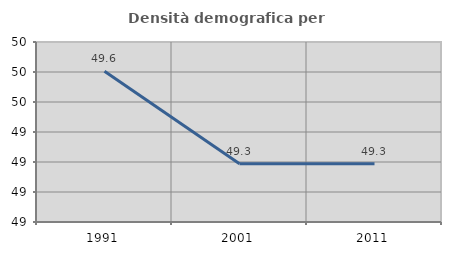
| Category | Densità demografica |
|---|---|
| 1991.0 | 49.603 |
| 2001.0 | 49.294 |
| 2011.0 | 49.294 |